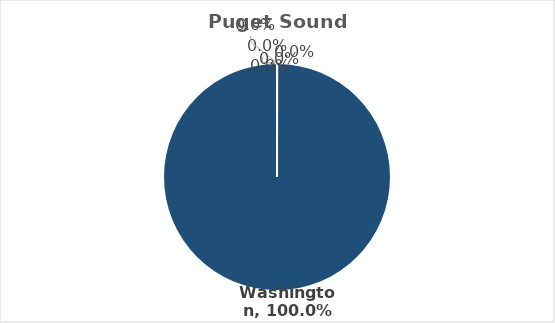
| Category | Series 0 |
|---|---|
| Washington | 1 |